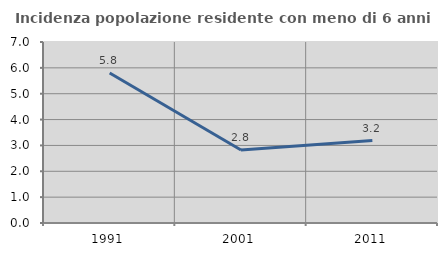
| Category | Incidenza popolazione residente con meno di 6 anni |
|---|---|
| 1991.0 | 5.801 |
| 2001.0 | 2.82 |
| 2011.0 | 3.187 |